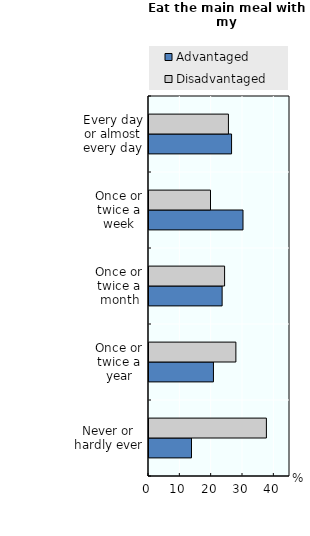
| Category | Advantaged | Disadvantaged |
|---|---|---|
| Never or hardly ever | 13.56 | 37.47 |
| Once or twice a year | 20.57 | 27.73 |
| Once or twice a month | 23.34 | 24.13 |
| Once or twice a week | 30 | 19.63 |
| Every day or almost every day | 26.35 | 25.35 |